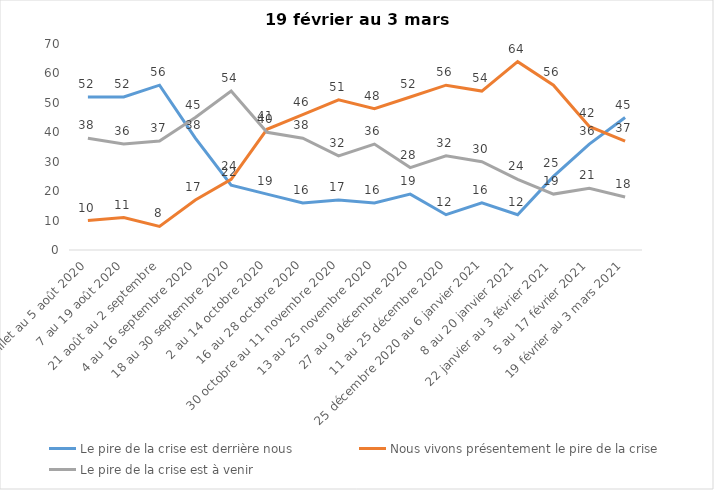
| Category | Le pire de la crise est derrière nous | Nous vivons présentement le pire de la crise | Le pire de la crise est à venir |
|---|---|---|---|
| 24 juillet au 5 août 2020 | 52 | 10 | 38 |
| 7 au 19 août 2020 | 52 | 11 | 36 |
| 21 août au 2 septembre | 56 | 8 | 37 |
| 4 au 16 septembre 2020 | 38 | 17 | 45 |
| 18 au 30 septembre 2020 | 22 | 24 | 54 |
| 2 au 14 octobre 2020 | 19 | 41 | 40 |
| 16 au 28 octobre 2020 | 16 | 46 | 38 |
| 30 octobre au 11 novembre 2020 | 17 | 51 | 32 |
| 13 au 25 novembre 2020 | 16 | 48 | 36 |
| 27 au 9 décembre 2020 | 19 | 52 | 28 |
| 11 au 25 décembre 2020 | 12 | 56 | 32 |
| 25 décembre 2020 au 6 janvier 2021 | 16 | 54 | 30 |
| 8 au 20 janvier 2021 | 12 | 64 | 24 |
| 22 janvier au 3 février 2021 | 25 | 56 | 19 |
| 5 au 17 février 2021 | 36 | 42 | 21 |
| 19 février au 3 mars 2021 | 45 | 37 | 18 |